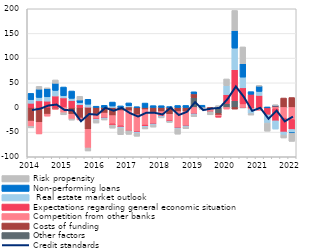
| Category | Other factors | Costs of funding | Competition from other banks | Expectations regarding general economic situation |  Real estate market outlook | Non-performing loans  | Risk propensity |
|---|---|---|---|---|---|---|---|
| 2014.0 | 0.064 | -27.614 | -10.883 | 8.513 | 7.366 | 12.572 | -2.931 |
| nan | 0 | -30.154 | -23.565 | 13.381 | 6.958 | 16.79 | 5.591 |
| nan | 0 | -13.58 | -4.04 | 12.84 | 8.698 | 16.68 | 1.322 |
| nan | 0 | -3.194 | -0.943 | 23.215 | 11.346 | 14.413 | 6.815 |
| 2015.0 | 0 | 1.584 | -10.634 | 17.798 | 4.391 | 17.665 | -4.309 |
| nan | 0 | -13.709 | -9.748 | 14.011 | 4.433 | 14.906 | -2.291 |
| nan | 0 | -21.32 | -4.036 | 5.521 | 4.364 | 5.262 | 7.435 |
| nan | 0 | -44.371 | -37.787 | 0.672 | 5.886 | 9.984 | -6.068 |
| 2016.0 | 0 | -13.683 | -9.865 | -0.183 | -2.017 | 2.537 | -5.896 |
| nan | 0 | -11.339 | -9.602 | -0.197 | -1.974 | 4.34 | -2.332 |
| nan | 0 | -16.54 | -16.708 | -2.652 | 2.885 | 8.061 | -6.073 |
| nan | 0 | -6.439 | -30.804 | -2.596 | -1.957 | 3.101 | -13.396 |
| 2017.0 | 1.137 | -6.563 | -40.484 | -0.096 | 2.394 | 5.669 | -7.434 |
| nan | 0 | -14.708 | -34.121 | -1.211 | -2.234 | 1.309 | -6.144 |
| nan | 0 | -4.365 | -31.359 | -2.483 | -2.033 | 8.902 | -3.307 |
| nan | 0 | -9.63 | -23.589 | -0.294 | -2.083 | 3.686 | -4.267 |
| 2018.0 | 0 | -8.401 | -9.465 | -0.308 | -2.087 | 3.545 | -0.758 |
| nan | 0 | -13.817 | -13.719 | -0.384 | -1.143 | 1.627 | -1.188 |
| nan | 0 | -8.391 | -32.723 | -0.405 | -2.001 | 3.96 | -10.656 |
| nan | 0 | -8.386 | -28.581 | -0.415 | -2.043 | 4.097 | -3.682 |
| 2019.0 | 19.953 | 7.614 | -12.529 | -0.41 | -2.062 | 4.174 | -3.764 |
| nan | 0 | -0.003 | 0 | -0.494 | 0 | 4.55 | -3.594 |
| nan | 0 | -3.529 | -4.583 | -0.546 | 0 | 0 | -6.275 |
| nan | -12.056 | -3.387 | -3.387 | -0.556 | 0 | 0 | 3.746 |
| 2020.0 | 8.2 | 0 | -3.3 | 17.776 | 18.324 | 0 | 13.5 |
| nan | 13.5 | -3.3 | 0 | 63.053 | 43.711 | 35.524 | 40.8 |
| nan | -0.7 | 0 | 7.2 | 32.599 | 21.695 | 27.071 | 34.2 |
| nan | -0.411 | -0.778 | -3.063 | 26.746 | -8.12 | 5.298 | -3.047 |
| 2021.0 | -0.834 | 0 | -5.032 | 24.468 | 7.975 | 11.008 | 0.658 |
| nan | 0 | 0 | 0 | -15.124 | -16.532 | 0.072 | -16.532 |
| nan | 0 | 2.953 | -2.953 | -24.203 | -16.663 | 1.353 | 0.892 |
| nan | 0 | 19.115 | -21.697 | -28.046 | -6.07 | 0 | -6.07 |
| 2022.0 | 0 | 20.1 | -24.6 | -20.1 | -6 | -1.3 | -16.8 |